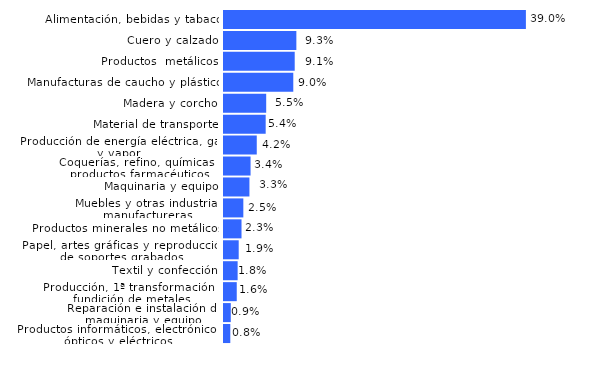
| Category | Año 2018 |
|---|---|
| Productos informáticos, electrónicos, ópticos y eléctricos | 0.008 |
| Reparación e instalación de maquinaria y equipo | 0.009 |
| Producción, 1ª transformación y fundición de metales | 0.016 |
| Textil y confección | 0.018 |
| Papel, artes gráficas y reproducción de soportes grabados | 0.019 |
| Productos minerales no metálicos | 0.023 |
| Muebles y otras industrias manufactureras | 0.025 |
| Maquinaria y equipo | 0.033 |
| Coquerías, refino, químicas y productos farmacéuticos | 0.034 |
| Producción de energía eléctrica, gas y vapor | 0.042 |
| Material de transporte | 0.054 |
| Madera y corcho | 0.055 |
| Manufacturas de caucho y plástico | 0.09 |
| Productos  metálicos | 0.091 |
| Cuero y calzado | 0.093 |
| Alimentación, bebidas y tabaco | 0.39 |